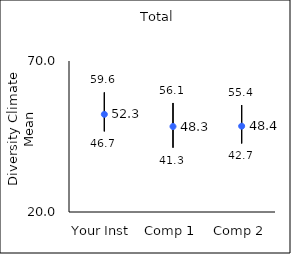
| Category | 25th percentile | 75th percentile | Mean |
|---|---|---|---|
| Your Inst | 46.7 | 59.6 | 52.34 |
| Comp 1 | 41.3 | 56.1 | 48.31 |
| Comp 2 | 42.7 | 55.4 | 48.42 |